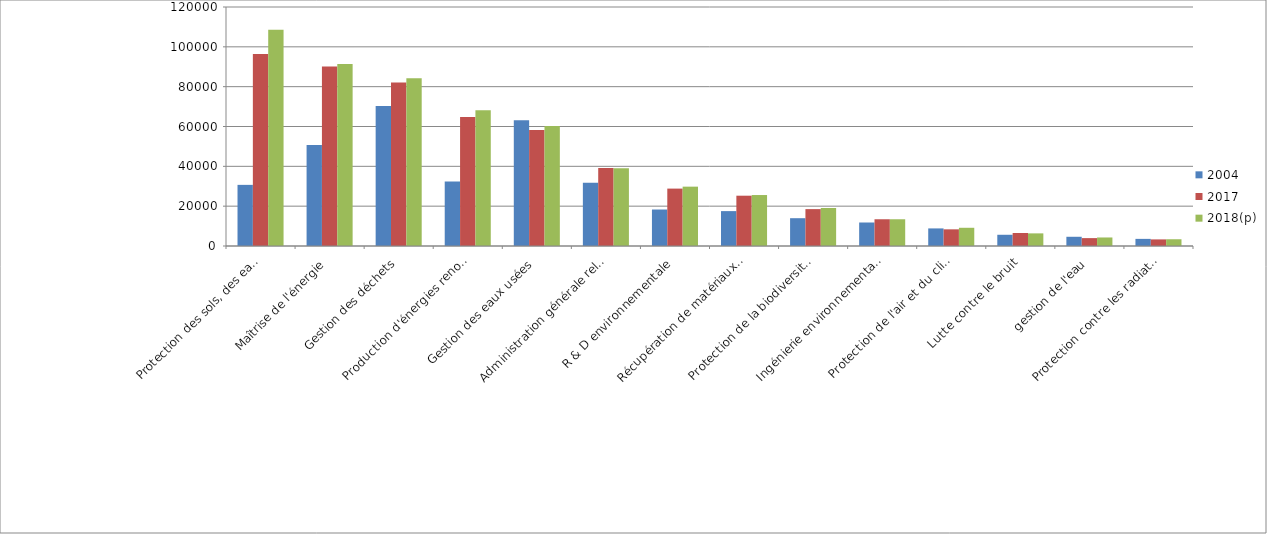
| Category | 2004 | 2017 | 2018(p) |
|---|---|---|---|
| Protection des sols, des eaux souterraines et des eaux de surface  | 30693 | 96408 | 108545 |
| Maîtrise de l'énergie | 50710 | 90181 | 91331 |
| Gestion des déchets | 70255 | 82139 | 84231 |
| Production d'énergies renouvelables | 32403 | 64776 | 68159 |
| Gestion des eaux usées | 63146 | 58271 | 60259 |
| Administration générale relative à l'environnement | 31717 | 39183 | 39077 |
| R & D environnementale | 18319 | 28819 | 29798 |
| Récupération de matériaux de recyclage | 17517 | 25257 | 25592 |
| Protection de la biodiversité et des paysages | 13960 | 18519 | 19086 |
| Ingénierie environnementale | 11800 | 13428 | 13428 |
| Protection de l'air et du climat | 8829 | 8368 | 9149 |
| Lutte contre le bruit | 5637 | 6537 | 6342 |
| gestion de l'eau | 4631 | 3959 | 4281 |
| Protection contre les radiations | 3576 | 3315 | 3392 |